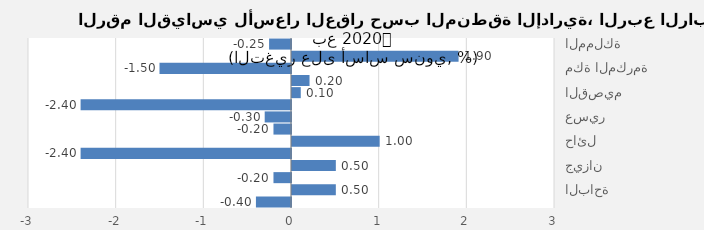
| Category | 2020 |
|---|---|
| المملكة | -0.25 |
| الرياض | 1.9 |
| مكة المكرمة | -1.5 |
| المدينة المنورة | 0.2 |
| القصيم | 0.1 |
| المنطقة الشرقية | -2.4 |
| عسير | -0.3 |
| تبوك | -0.2 |
| حائل | 1 |
| المنطقة الشمالية | -2.4 |
| جيزان | 0.5 |
| نجران | -0.2 |
| الباحة | 0.5 |
| الجوف | -0.4 |